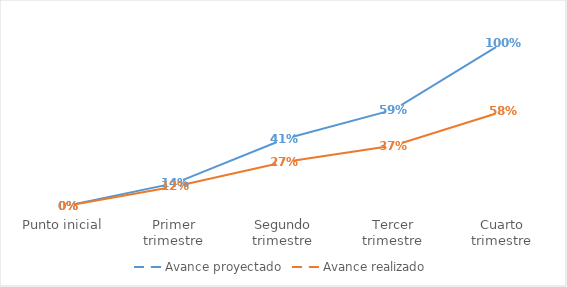
| Category | Avance proyectado |
|---|---|
| Punto inicial | 0 |
| Primer trimestre | 0.14 |
| Segundo trimestre | 0.41 |
| Tercer trimestre | 0.59 |
| Cuarto trimestre | 1 |